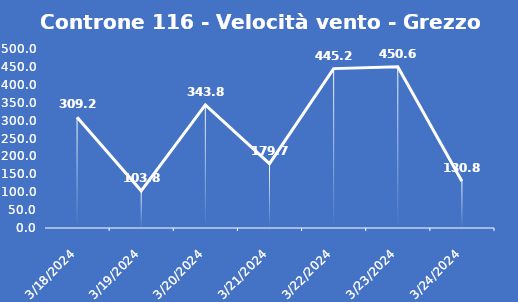
| Category | Controne 116 - Velocità vento - Grezzo (min) |
|---|---|
| 3/18/24 | 309.2 |
| 3/19/24 | 103.8 |
| 3/20/24 | 343.8 |
| 3/21/24 | 179.7 |
| 3/22/24 | 445.2 |
| 3/23/24 | 450.6 |
| 3/24/24 | 130.8 |